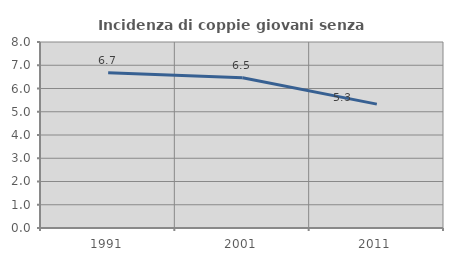
| Category | Incidenza di coppie giovani senza figli |
|---|---|
| 1991.0 | 6.673 |
| 2001.0 | 6.465 |
| 2011.0 | 5.328 |